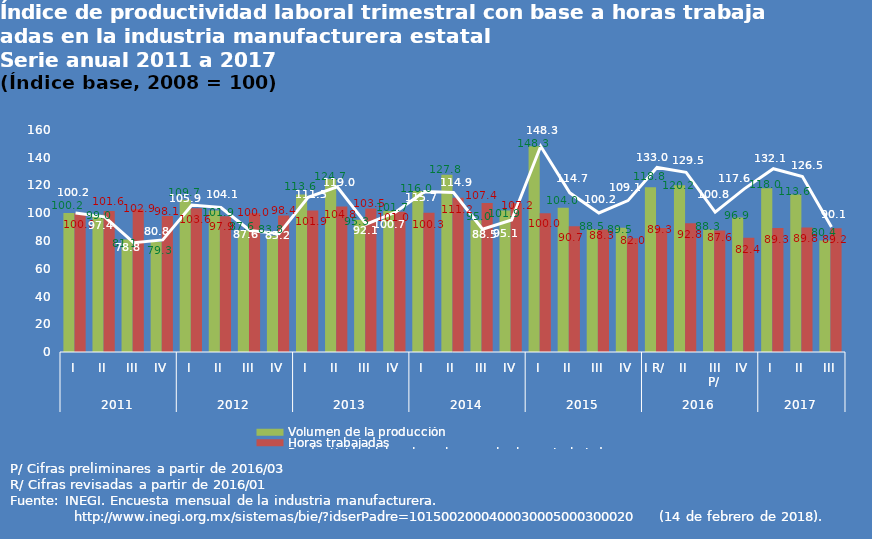
| Category | Volumen de la producción | Horas trabajadas |
|---|---|---|
| 0 | 100.2 | 100 |
| 1 | 99 | 101.6 |
| 2 | 81.1 | 102.9 |
| 3 | 79.3 | 98.1 |
| 4 | 109.7 | 103.6 |
| 5 | 101.9 | 97.9 |
| 6 | 87.6 | 100 |
| 7 | 83.8 | 98.4 |
| 8 | 113.6 | 101.9 |
| 9 | 124.7 | 104.8 |
| 10 | 95.3 | 103.5 |
| 11 | 101.7 | 101 |
| 12 | 116 | 100.3 |
| 13 | 127.8 | 111.2 |
| 14 | 95 | 107.4 |
| 15 | 101.9 | 107.2 |
| 16 | 148.3 | 100 |
| 17 | 104 | 90.7 |
| 18 | 88.5 | 88.3 |
| 19 | 89.5 | 82 |
| 20 | 118.8 | 89.3 |
| 21 | 120.2 | 92.8 |
| 22 | 88.3 | 87.6 |
| 23 | 96.9 | 82.4 |
| 24 | 118 | 89.3 |
| 25 | 113.6 | 89.8 |
| 26 | 80.4 | 89.2 |